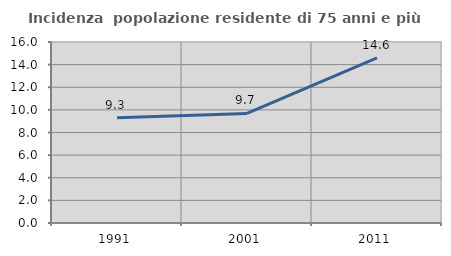
| Category | Incidenza  popolazione residente di 75 anni e più |
|---|---|
| 1991.0 | 9.3 |
| 2001.0 | 9.681 |
| 2011.0 | 14.595 |